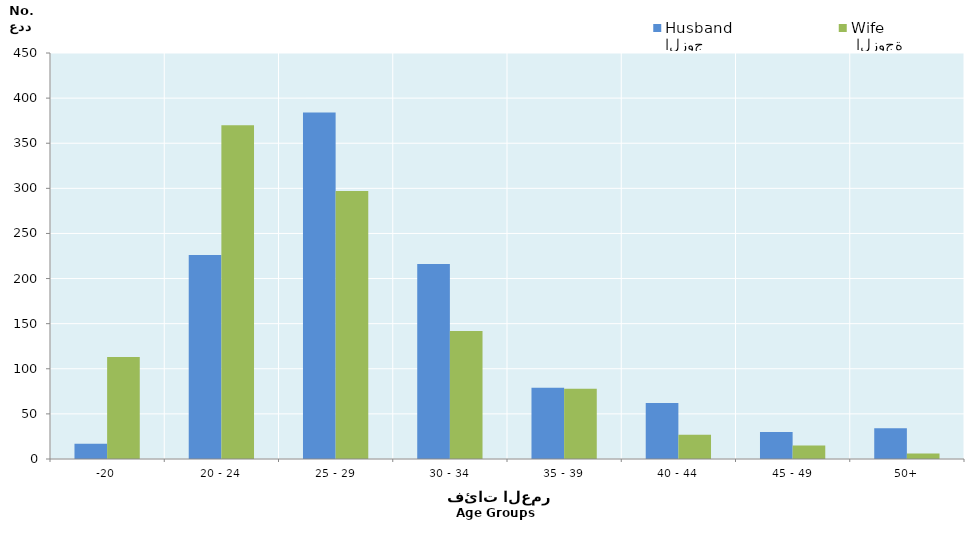
| Category | الزوج
Husband |  الزوجة
Wife |
|---|---|---|
| -20 | 17 | 113 |
| 20 - 24 | 226 | 370 |
| 25 - 29 | 384 | 297 |
| 30 - 34 | 216 | 142 |
| 35 - 39 | 79 | 78 |
| 40 - 44 | 62 | 27 |
| 45 - 49 | 30 | 15 |
| 50+ | 34 | 6 |